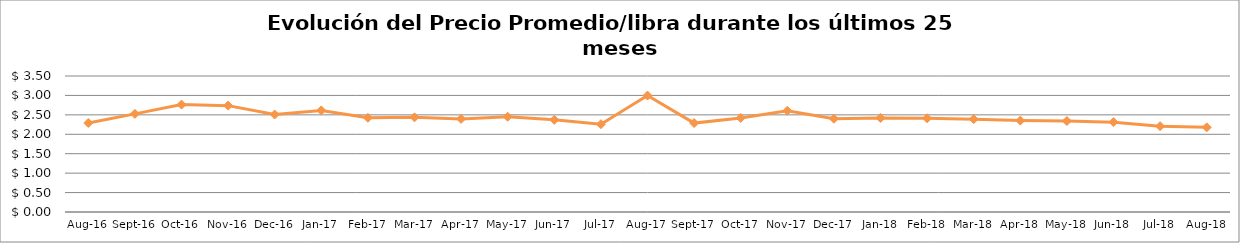
| Category | Series 0 |
|---|---|
| 2016-08-01 | 2.292 |
| 2016-09-01 | 2.525 |
| 2016-10-01 | 2.764 |
| 2016-11-01 | 2.737 |
| 2016-12-01 | 2.508 |
| 2017-01-01 | 2.615 |
| 2017-02-01 | 2.424 |
| 2017-03-01 | 2.436 |
| 2017-04-01 | 2.396 |
| 2017-05-01 | 2.452 |
| 2017-06-01 | 2.372 |
| 2017-07-01 | 2.26 |
| 2017-08-01 | 2.997 |
| 2017-09-01 | 2.288 |
| 2017-10-01 | 2.421 |
| 2017-11-01 | 2.605 |
| 2017-12-01 | 2.4 |
| 2018-01-01 | 2.42 |
| 2018-02-01 | 2.412 |
| 2018-03-01 | 2.388 |
| 2018-04-01 | 2.352 |
| 2018-05-01 | 2.341 |
| 2018-06-01 | 2.312 |
| 2018-07-01 | 2.209 |
| 2018-08-01 | 2.178 |